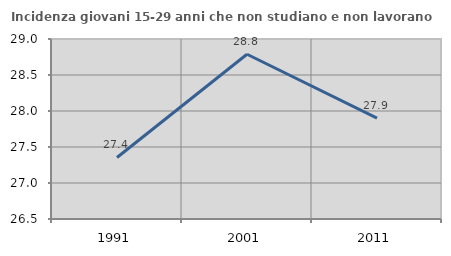
| Category | Incidenza giovani 15-29 anni che non studiano e non lavorano  |
|---|---|
| 1991.0 | 27.355 |
| 2001.0 | 28.788 |
| 2011.0 | 27.902 |